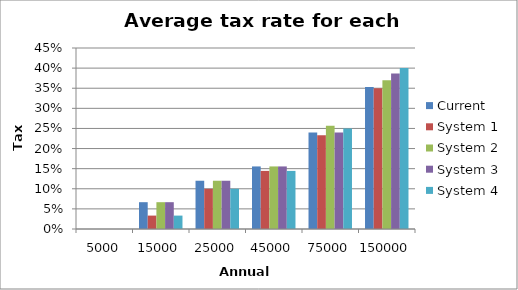
| Category | Current | System 1 | System 2 | System 3 | System 4 |
|---|---|---|---|---|---|
| 5000.0 | 0 | 0 | 0 | 0 | 0 |
| 15000.0 | 0.067 | 0.033 | 0.067 | 0.067 | 0.033 |
| 25000.0 | 0.12 | 0.1 | 0.12 | 0.12 | 0.1 |
| 45000.0 | 0.156 | 0.144 | 0.156 | 0.156 | 0.144 |
| 75000.0 | 0.24 | 0.233 | 0.257 | 0.24 | 0.25 |
| 150000.0 | 0.353 | 0.35 | 0.37 | 0.387 | 0.4 |